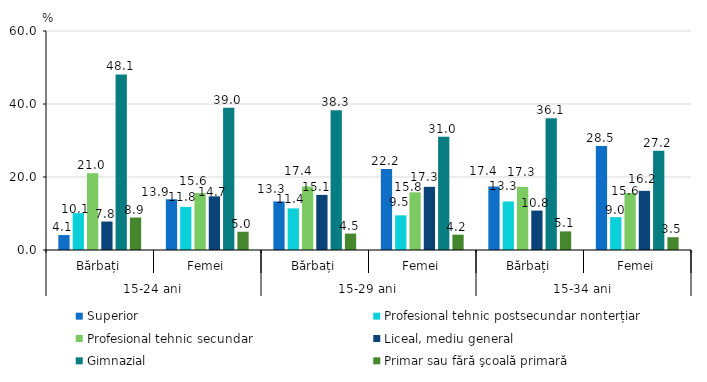
| Category | Superior | Profesional tehnic postsecundar nonterțiar | Profesional tehnic secundar | Liceal, mediu general | Gimnazial | Primar sau fără şcoală primară |
|---|---|---|---|---|---|---|
| 0 | 4.1 | 10.1 | 21 | 7.8 | 48.1 | 8.9 |
| 1 | 13.9 | 11.8 | 15.6 | 14.7 | 39 | 5 |
| 2 | 13.3 | 11.4 | 17.4 | 15.1 | 38.3 | 4.5 |
| 3 | 22.2 | 9.5 | 15.8 | 17.3 | 31 | 4.2 |
| 4 | 17.4 | 13.3 | 17.3 | 10.8 | 36.1 | 5.1 |
| 5 | 28.5 | 9 | 15.6 | 16.2 | 27.2 | 3.5 |